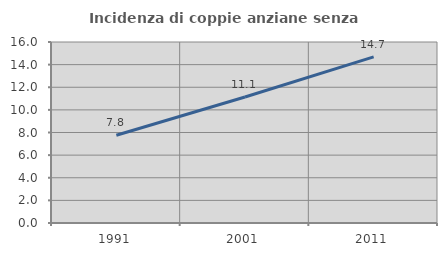
| Category | Incidenza di coppie anziane senza figli  |
|---|---|
| 1991.0 | 7.759 |
| 2001.0 | 11.141 |
| 2011.0 | 14.683 |